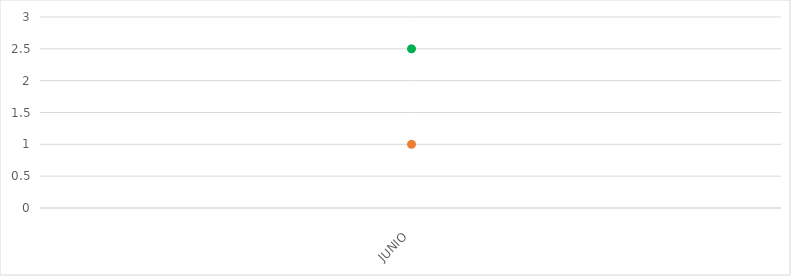
| Category | VALOR  | META PONDERADA |
|---|---|---|
| JUNIO | 1 | 2.5 |